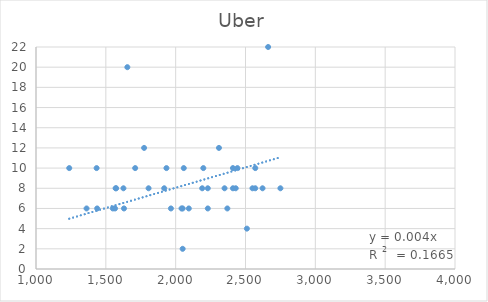
| Category | Uber |
|---|---|
| 1550.0 | 6 |
| 2310.0 | 12 |
| 1570.0 | 8 |
| 2042.0 | 6 |
| 1934.0 | 10 |
| 1630.0 | 6 |
| 1574.0 | 8 |
| 1566.0 | 6 |
| 2050.0 | 6 |
| 2350.0 | 8 |
| 1918.0 | 8 |
| 1438.0 | 6 |
| 1654.0 | 20 |
| 2058.0 | 10 |
| 2442.0 | 10 |
| 2050.0 | 2 |
| 1966.0 | 6 |
| 2550.0 | 8 |
| 2198.0 | 10 |
| 1626.0 | 8 |
| 2510.0 | 4 |
| 2410.0 | 10 |
| 2622.0 | 8 |
| 1362.0 | 6 |
| 2750.0 | 8 |
| 1806.0 | 8 |
| 2190.0 | 8 |
| 2430.0 | 8 |
| 2094.0 | 6 |
| 2570.0 | 8 |
| 2410.0 | 8 |
| 1774.0 | 12 |
| 1710.0 | 10 |
| 2370.0 | 6 |
| 2230.0 | 6 |
| 2570.0 | 10 |
| 2662.0 | 22 |
| 1238.0 | 10 |
| 2230.0 | 8 |
| 1434.0 | 10 |